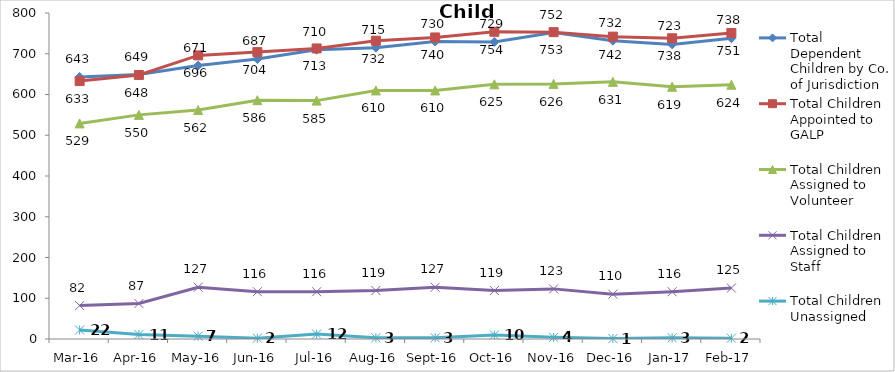
| Category | Total Dependent Children by Co. of Jurisdiction | Total Children Appointed to GALP | Total Children Assigned to Volunteer | Total Children Assigned to Staff | Total Children Unassigned |
|---|---|---|---|---|---|
| Mar-16 | 643 | 633 | 529 | 82 | 22 |
| Apr-16 | 649 | 648 | 550 | 87 | 11 |
| May-16 | 671 | 696 | 562 | 127 | 7 |
| Jun-16 | 687 | 704 | 586 | 116 | 2 |
| Jul-16 | 710 | 713 | 585 | 116 | 12 |
| Aug-16 | 715 | 732 | 610 | 119 | 3 |
| Sep-16 | 730 | 740 | 610 | 127 | 3 |
| Oct-16 | 729 | 754 | 625 | 119 | 10 |
| Nov-16 | 752 | 753 | 626 | 123 | 4 |
| Dec-16 | 732 | 742 | 631 | 110 | 1 |
| Jan-17 | 723 | 738 | 619 | 116 | 3 |
| Feb-17 | 738 | 751 | 624 | 125 | 2 |